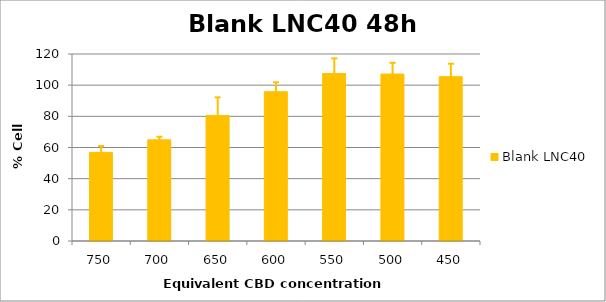
| Category | Blank LNC40 |
|---|---|
| 750.0 | 56.855 |
| 700.0 | 64.934 |
| 650.0 | 80.496 |
| 600.0 | 95.809 |
| 550.0 | 107.465 |
| 500.0 | 107.131 |
| 450.0 | 105.467 |